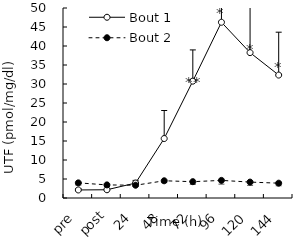
| Category | Bout 1 | Bout 2 |
|---|---|---|
| pre | 2.117 | 3.983 |
| post | 2.17 | 3.447 |
| 24 | 3.932 | 3.357 |
| 48 | 15.648 | 4.53 |
| 72 | 30.755 | 4.295 |
| 96 | 46.25 | 4.637 |
| 120 | 38.255 | 4.189 |
| 144 | 32.349 | 3.899 |